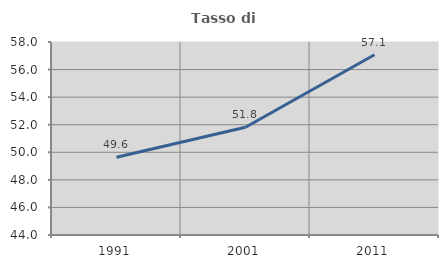
| Category | Tasso di occupazione   |
|---|---|
| 1991.0 | 49.643 |
| 2001.0 | 51.812 |
| 2011.0 | 57.071 |